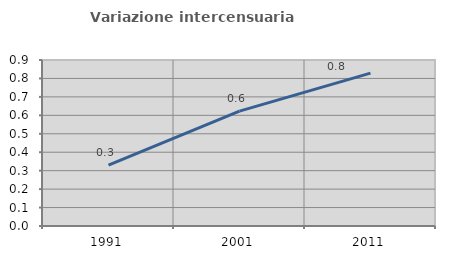
| Category | Variazione intercensuaria annua |
|---|---|
| 1991.0 | 0.33 |
| 2001.0 | 0.623 |
| 2011.0 | 0.829 |